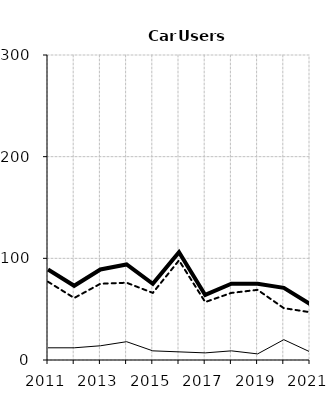
| Category | Built-up | Non built-up | Total |
|---|---|---|---|
| 2011.0 | 12 | 77 | 89 |
| 2012.0 | 12 | 61 | 73 |
| 2013.0 | 14 | 75 | 89 |
| 2014.0 | 18 | 76 | 94 |
| 2015.0 | 9 | 66 | 75 |
| 2016.0 | 8 | 98 | 106 |
| 2017.0 | 7 | 57 | 64 |
| 2018.0 | 9 | 66 | 75 |
| 2019.0 | 6 | 69 | 75 |
| 2020.0 | 20 | 51 | 71 |
| 2021.0 | 8 | 47 | 55 |